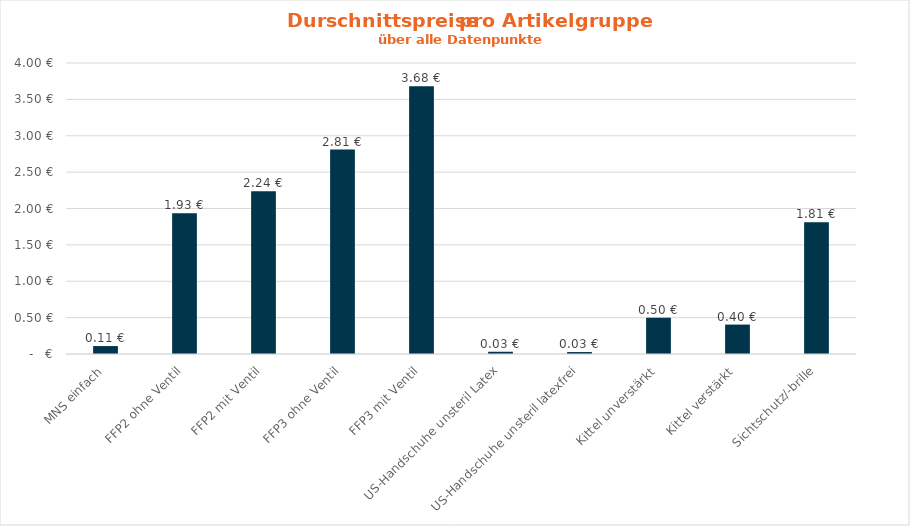
| Category | Series 0 |
|---|---|
| MNS einfach | 0.109 |
| FFP2 ohne Ventil | 1.934 |
| FFP2 mit Ventil | 2.237 |
| FFP3 ohne Ventil | 2.811 |
| FFP3 mit Ventil | 3.681 |
| US-Handschuhe unsteril Latex | 0.031 |
| US-Handschuhe unsteril latexfrei | 0.027 |
| Kittel unverstärkt | 0.5 |
| Kittel verstärkt | 0.404 |
| Sichtschutz/-brille | 1.812 |